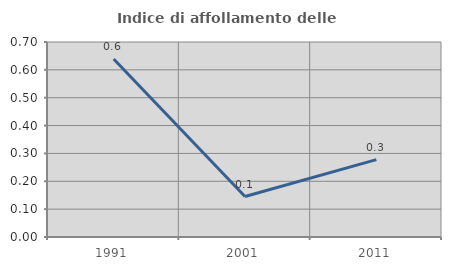
| Category | Indice di affollamento delle abitazioni  |
|---|---|
| 1991.0 | 0.639 |
| 2001.0 | 0.145 |
| 2011.0 | 0.278 |